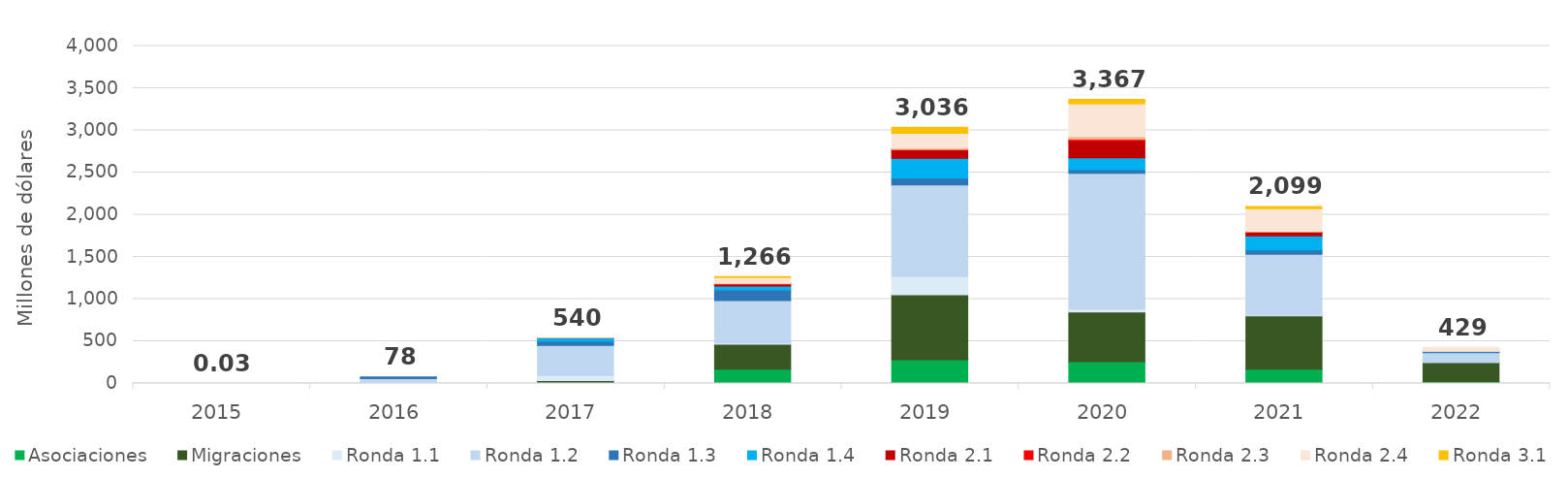
| Category | Asociaciones | Migraciones | Ronda 1.1 | Ronda 1.2 | Ronda 1.3 | Ronda 1.4 | Ronda 2.1 | Ronda 2.2 | Ronda 2.3 | Ronda 2.4 | Ronda 3.1 |
|---|---|---|---|---|---|---|---|---|---|---|---|
| 2015.0 | 0 | 0 | 0.023 | 0.003 | 0 | 0 | 0 | 0 | 0 | 0 | 0 |
| 2016.0 | 0 | 0 | 7.936 | 50.902 | 19.085 | 0 | 0 | 0 | 0 | 0 | 0 |
| 2017.0 | 1.551 | 32.93 | 60.276 | 356.292 | 49.062 | 38.707 | 0.93 | 0 | 0.096 | 0 | 0 |
| 2018.0 | 168.66 | 295.724 | 16.154 | 501.142 | 126.084 | 47.616 | 24.075 | 1.091 | 9.662 | 66.299 | 9.669 |
| 2019.0 | 280.617 | 772.208 | 213.486 | 1086.442 | 82.07 | 235.595 | 92.887 | 9.67 | 17.942 | 175.703 | 69.349 |
| 2020.0 | 258.021 | 590.016 | 33.998 | 1610.735 | 43.009 | 140.295 | 200.372 | 18.149 | 30.336 | 391.695 | 49.906 |
| 2021.0 | 169.637 | 631.095 | 8.483 | 723.208 | 51.023 | 167.952 | 40.422 | 3.959 | 8.149 | 268.135 | 26.994 |
| 2022.0 | 20.381 | 226.033 | 0 | 118.55 | 12.353 | 4.568 | 0 | 0 | 0.894 | 46.691 | 0 |